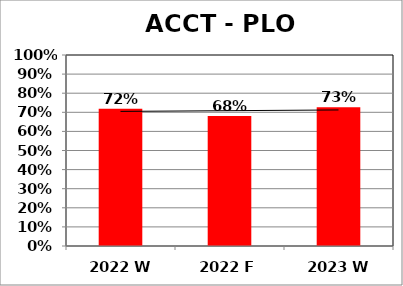
| Category | Series 0 |
|---|---|
| 2022 W | 0.719 |
| 2022 F | 0.68 |
| 2023 W | 0.726 |